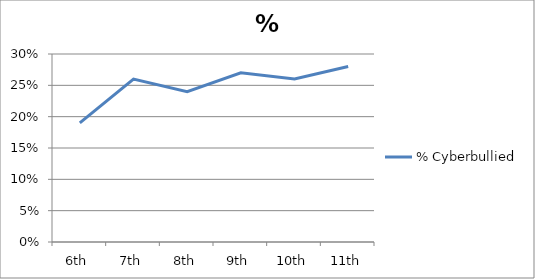
| Category | % Cyberbullied |
|---|---|
| 6th | 0.19 |
| 7th | 0.26 |
| 8th | 0.24 |
| 9th | 0.27 |
| 10th | 0.26 |
| 11th | 0.28 |